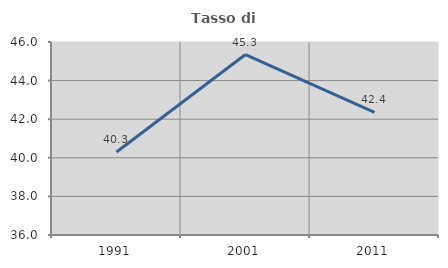
| Category | Tasso di occupazione   |
|---|---|
| 1991.0 | 40.302 |
| 2001.0 | 45.35 |
| 2011.0 | 42.359 |